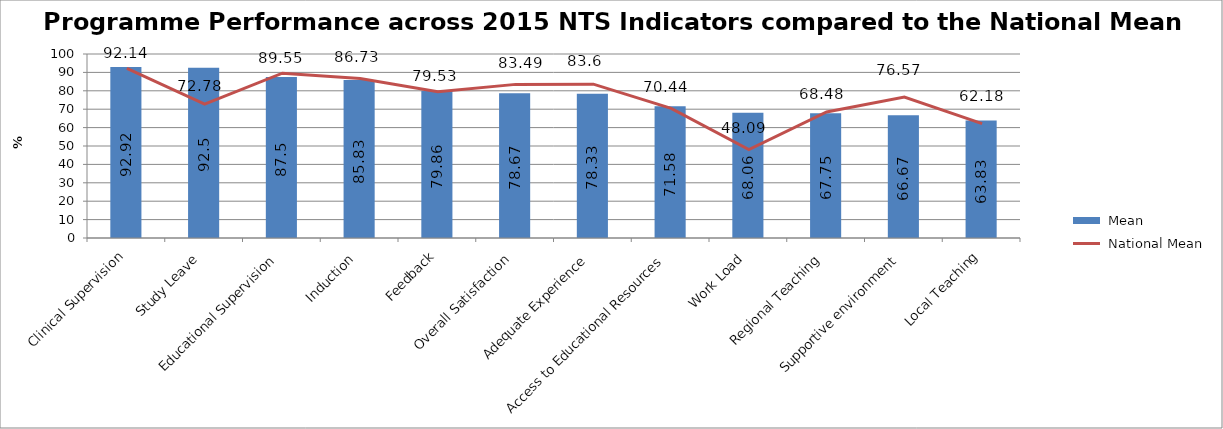
| Category |  Mean |
|---|---|
| Clinical Supervision | 92.92 |
| Study Leave | 92.5 |
| Educational Supervision | 87.5 |
| Induction | 85.83 |
| Feedback | 79.86 |
| Overall Satisfaction | 78.67 |
| Adequate Experience | 78.33 |
| Access to Educational Resources | 71.58 |
| Work Load | 68.06 |
| Regional Teaching | 67.75 |
| Supportive environment | 66.67 |
| Local Teaching | 63.83 |